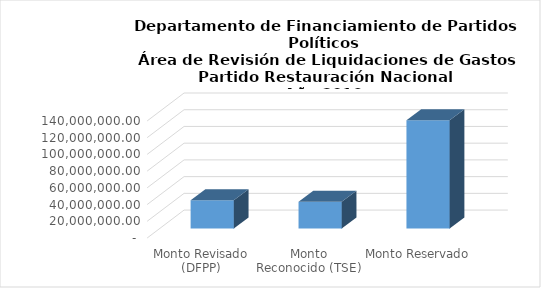
| Category | Series 0 |
|---|---|
| Monto Revisado (DFPP) | 33741880.7 |
| Monto Reconocido (TSE) | 31985525.3 |
| Monto Reservado  | 129484248.386 |